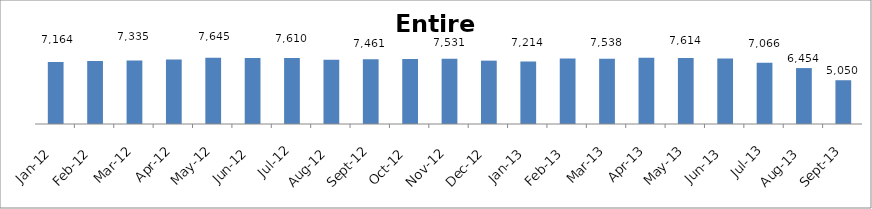
| Category | Inactive Premise with UKU |
|---|---|
| 2012-01-01 | 7164 |
| 2012-02-01 | 7267 |
| 2012-03-01 | 7335 |
| 2012-04-01 | 7441 |
| 2012-05-01 | 7645 |
| 2012-06-01 | 7603 |
| 2012-07-01 | 7610 |
| 2012-08-01 | 7402 |
| 2012-09-01 | 7461 |
| 2012-10-01 | 7500 |
| 2012-11-01 | 7531 |
| 2012-12-01 | 7310 |
| 2013-01-01 | 7214 |
| 2013-02-01 | 7556 |
| 2013-03-01 | 7538 |
| 2013-04-01 | 7636 |
| 2013-05-01 | 7614 |
| 2013-06-01 | 7550 |
| 2013-07-01 | 7066 |
| 2013-08-01 | 6454 |
| 2013-09-01 | 5050 |